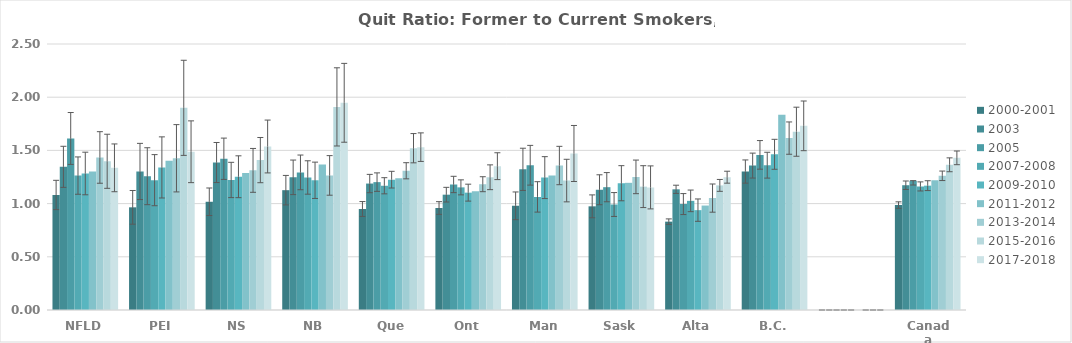
| Category | 2000-2001 | 2003 | 2005 | 2007-2008 | 2009-2010 | 2011-2012 | 2013-2014 | 2015-2016 | 2017-2018 |
|---|---|---|---|---|---|---|---|---|---|
| NFLD | 1.081 | 1.346 | 1.612 | 1.263 | 1.283 | 1.303 | 1.434 | 1.398 | 1.336 |
| PEI | 0.965 | 1.302 | 1.257 | 1.22 | 1.34 | 1.403 | 1.426 | 1.9 | 1.487 |
| NS | 1.017 | 1.386 | 1.422 | 1.222 | 1.252 | 1.288 | 1.312 | 1.409 | 1.537 |
| NB | 1.126 | 1.247 | 1.293 | 1.246 | 1.219 | 1.368 | 1.265 | 1.909 | 1.947 |
| Que | 0.949 | 1.188 | 1.202 | 1.168 | 1.225 | 1.237 | 1.309 | 1.521 | 1.53 |
| Ont | 0.959 | 1.084 | 1.18 | 1.153 | 1.103 | 1.117 | 1.182 | 1.248 | 1.352 |
| Man | 0.979 | 1.322 | 1.36 | 1.063 | 1.244 | 1.265 | 1.358 | 1.216 | 1.471 |
| Sask | 0.974 | 1.13 | 1.154 | 0.991 | 1.191 | 1.195 | 1.251 | 1.159 | 1.152 |
| Alta | 0.83 | 1.134 | 0.996 | 1.026 | 0.939 | 0.982 | 1.052 | 1.171 | 1.248 |
| B.C. | 1.301 | 1.357 | 1.458 | 1.361 | 1.463 | 1.836 | 1.616 | 1.675 | 1.731 |
|  | 0 | 0 | 0 | 0 | 0 | 0 | 0 | 0 | 0 |
| Canada | 0.986 | 1.173 | 1.216 | 1.161 | 1.169 | 1.22 | 1.261 | 1.365 | 1.43 |